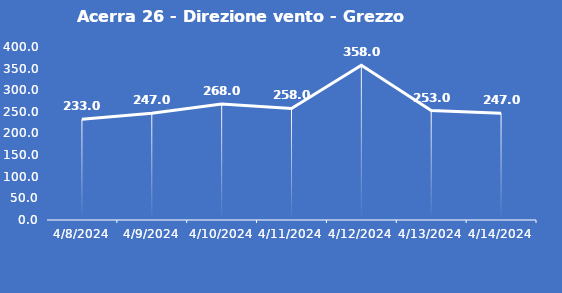
| Category | Acerra 26 - Direzione vento - Grezzo (°N) |
|---|---|
| 4/8/24 | 233 |
| 4/9/24 | 247 |
| 4/10/24 | 268 |
| 4/11/24 | 258 |
| 4/12/24 | 358 |
| 4/13/24 | 253 |
| 4/14/24 | 247 |